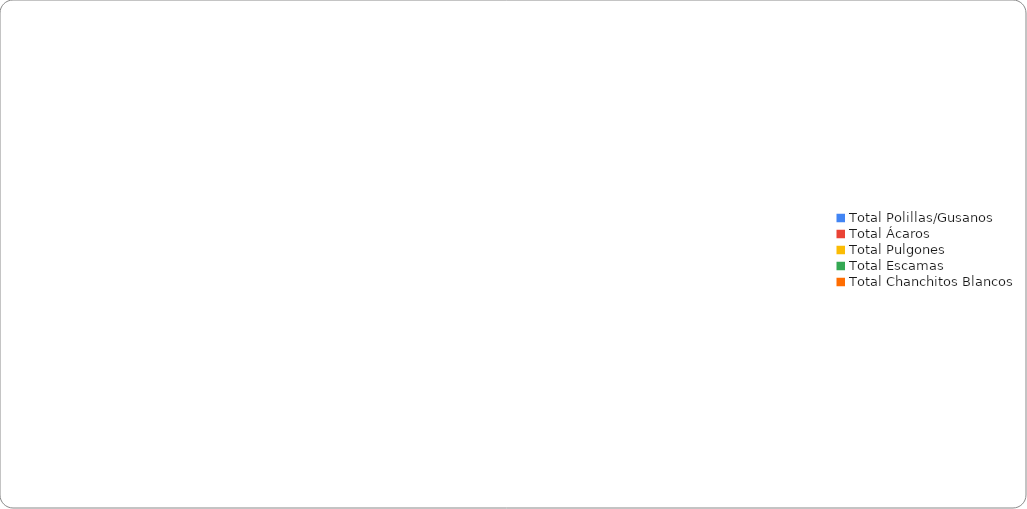
| Category | Series 0 |
|---|---|
| Total Polillas/Gusanos | 0 |
| Total Ácaros | 0 |
| Total Pulgones | 0 |
| Total Escamas | 0 |
| Total Chanchitos Blancos | 0 |